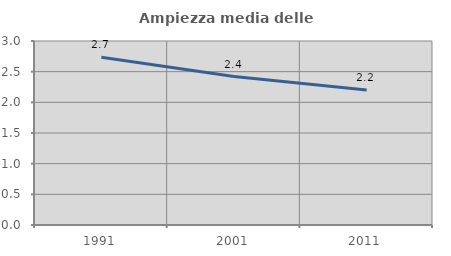
| Category | Ampiezza media delle famiglie |
|---|---|
| 1991.0 | 2.736 |
| 2001.0 | 2.419 |
| 2011.0 | 2.2 |